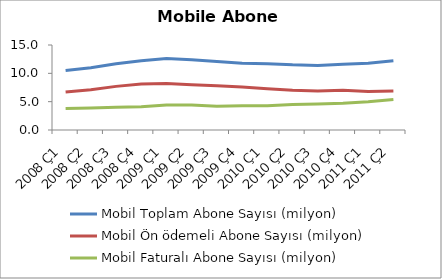
| Category | Mobil Toplam Abone Sayısı (milyon) | Mobil Ön ödemeli Abone Sayısı (milyon) | Mobil Faturalı Abone Sayısı (milyon) |
|---|---|---|---|
| 2008 Ç1 | 10.5 | 6.7 | 3.8 |
| 2008 Ç2 | 11 | 7.1 | 3.9 |
| 2008 Ç3 | 11.7 | 7.7 | 4 |
| 2008 Ç4 | 12.2 | 8.1 | 4.1 |
| 2009 Ç1 | 12.6 | 8.2 | 4.4 |
| 2009 Ç2 | 12.4 | 8 | 4.4 |
| 2009 Ç3 | 12.1 | 7.8 | 4.2 |
| 2009 Ç4 | 11.8 | 7.6 | 4.3 |
| 2010 Ç1 | 11.7 | 7.3 | 4.3 |
| 2010 Ç2 | 11.5 | 7 | 4.5 |
| 2010 Ç3 | 11.4 | 6.9 | 4.6 |
| 2010 Ç4 | 11.6 | 7 | 4.7 |
| 2011 Ç1 | 11.8 | 6.8 | 5 |
| 2011 Ç2 | 12.2 | 6.9 | 5.4 |